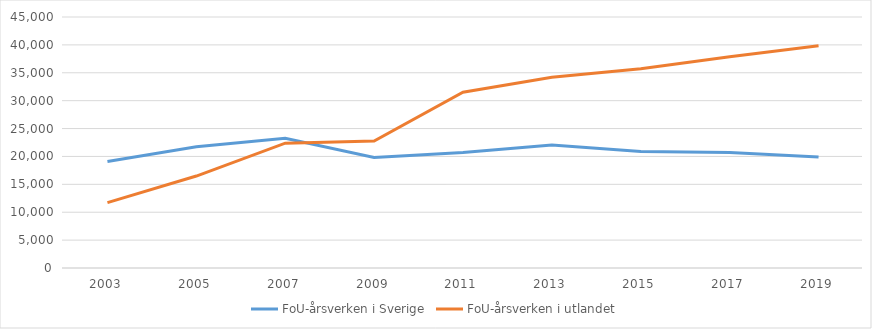
| Category | FoU-årsverken i Sverige | FoU-årsverken i utlandet |
|---|---|---|
| 2003.0 | 19085 | 11718 |
| 2005.0 | 21720 | 16484.4 |
| 2007.0 | 23239 | 22374.3 |
| 2009.0 | 19825 | 22760 |
| 2011.0 | 20728 | 31508 |
| 2013.0 | 22037 | 34186 |
| 2015.0 | 20874 | 35720 |
| 2017.0 | 20726 | 37879 |
| 2019.0 | 19919 | 39851 |